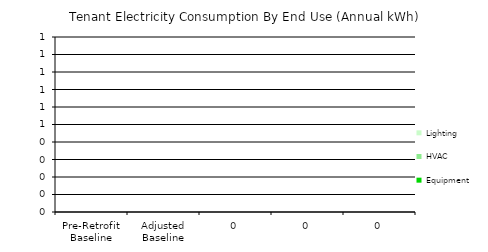
| Category | Equipment | HVAC | Lighting |
|---|---|---|---|
| Pre-Retrofit Baseline | 0 | 0 | 0 |
| Adjusted Baseline | 0 | 0 | 0 |
| 0 | 0 | 0 | 0 |
| 0 | 0 | 0 | 0 |
| 0 | 0 | 0 | 0 |